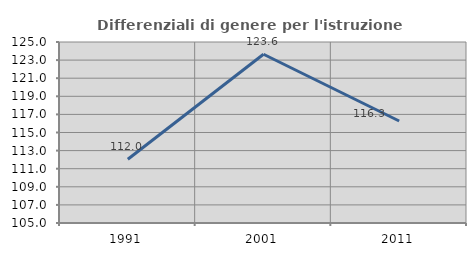
| Category | Differenziali di genere per l'istruzione superiore |
|---|---|
| 1991.0 | 112.045 |
| 2001.0 | 123.648 |
| 2011.0 | 116.273 |